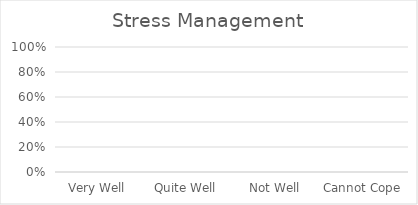
| Category | Series 0 |
|---|---|
| Very Well | 0 |
| Quite Well | 0 |
| Not Well | 0 |
| Cannot Cope | 0 |